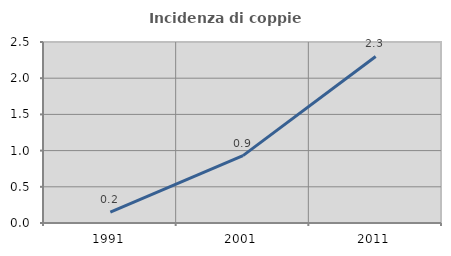
| Category | Incidenza di coppie miste |
|---|---|
| 1991.0 | 0.152 |
| 2001.0 | 0.93 |
| 2011.0 | 2.301 |